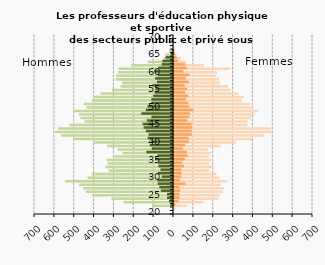
| Category | Femmes public | Femmes privé |
|---|---|---|
| 20.0 | 0 | 0 |
| 21.0 | 6 | 1 |
| 22.0 | 64 | 8 |
| 23.0 | 148 | 22 |
| 24.0 | 222 | 28 |
| 25.0 | 230 | 27 |
| 26.0 | 248 | 32 |
| 27.0 | 251 | 27 |
| 28.0 | 235 | 58 |
| 29.0 | 268 | 30 |
| 30.0 | 229 | 36 |
| 31.0 | 214 | 39 |
| 32.0 | 178 | 37 |
| 33.0 | 202 | 51 |
| 34.0 | 177 | 42 |
| 35.0 | 185 | 55 |
| 36.0 | 177 | 69 |
| 37.0 | 187 | 65 |
| 38.0 | 172 | 44 |
| 39.0 | 234 | 56 |
| 40.0 | 311 | 75 |
| 41.0 | 392 | 74 |
| 42.0 | 451 | 91 |
| 43.0 | 493 | 89 |
| 44.0 | 486 | 91 |
| 45.0 | 371 | 89 |
| 46.0 | 370 | 67 |
| 47.0 | 385 | 78 |
| 48.0 | 407 | 80 |
| 49.0 | 426 | 98 |
| 50.0 | 400 | 77 |
| 51.0 | 382 | 72 |
| 52.0 | 341 | 60 |
| 53.0 | 351 | 71 |
| 54.0 | 323 | 56 |
| 55.0 | 284 | 65 |
| 56.0 | 272 | 53 |
| 57.0 | 233 | 75 |
| 58.0 | 226 | 59 |
| 59.0 | 213 | 78 |
| 60.0 | 217 | 47 |
| 61.0 | 283 | 64 |
| 62.0 | 152 | 57 |
| 63.0 | 58 | 21 |
| 64.0 | 33 | 14 |
| 65.0 | 14 | 5 |
| 66.0 | 3 | 2 |
| 67.0 | 0 | 1 |
| 68.0 | 0 | 0 |
| 69.0 | 0 | 0 |
| 70.0 | 0 | 0 |